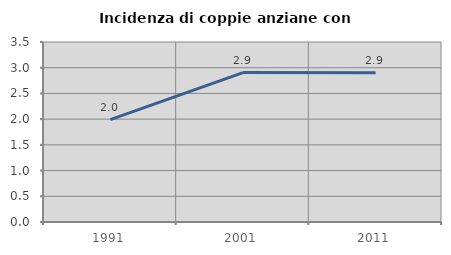
| Category | Incidenza di coppie anziane con figli |
|---|---|
| 1991.0 | 1.989 |
| 2001.0 | 2.906 |
| 2011.0 | 2.901 |